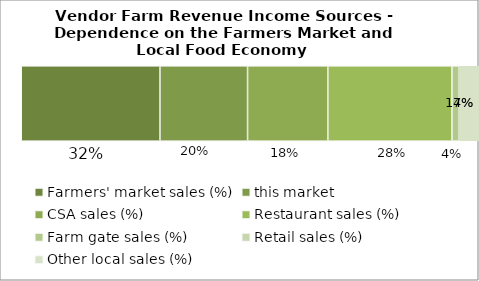
| Category | Farmers' market sales (%) | this market | CSA sales (%) | Restaurant sales (%) | Farm gate sales (%) | Retail sales (%) | Other local sales (%) |
|---|---|---|---|---|---|---|---|
| 0 | 0.317 | 0.2 | 0.183 | 0.283 | 0.04 | 0.173 | 0.037 |